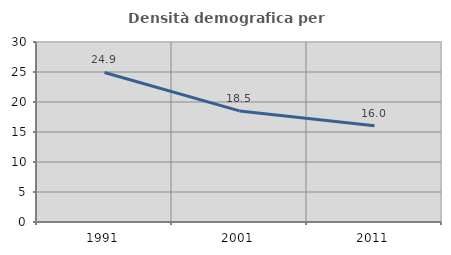
| Category | Densità demografica |
|---|---|
| 1991.0 | 24.924 |
| 2001.0 | 18.515 |
| 2011.0 | 16.023 |